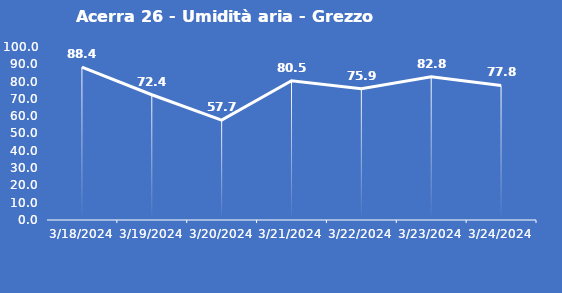
| Category | Acerra 26 - Umidità aria - Grezzo (%) |
|---|---|
| 3/18/24 | 88.4 |
| 3/19/24 | 72.4 |
| 3/20/24 | 57.7 |
| 3/21/24 | 80.5 |
| 3/22/24 | 75.9 |
| 3/23/24 | 82.8 |
| 3/24/24 | 77.8 |